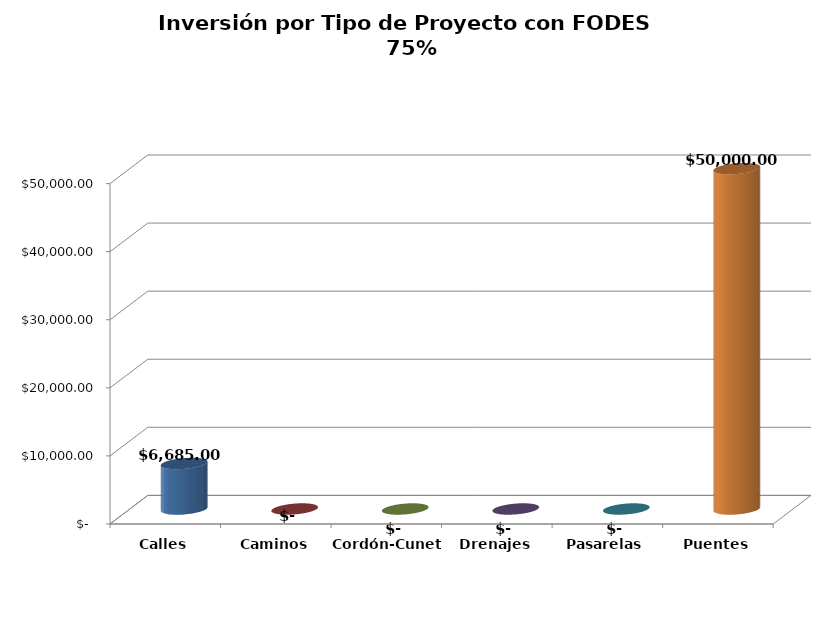
| Category | Series 0 |
|---|---|
| Calles | 6685 |
| Caminos | 0 |
| Cordón-Cuneta | 0 |
| Drenajes | 0 |
| Pasarelas | 0 |
| Puentes | 50000 |